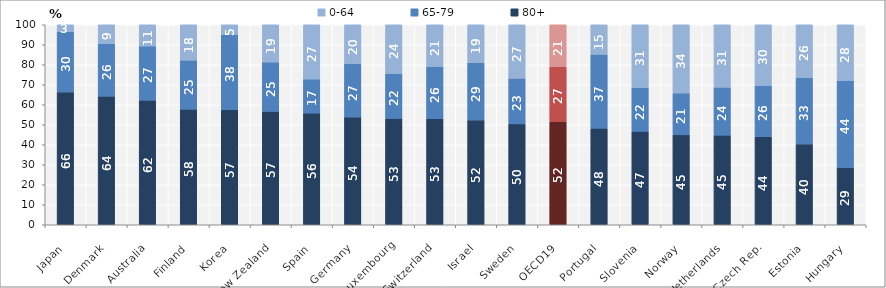
| Category | 80+ | 65-79 | 0-64 |
|---|---|---|---|
| Japan | 66.345 | 30.219 | 3.436 |
| Denmark | 64.263 | 26.3 | 9.436 |
| Australia | 62.239 | 27.13 | 10.632 |
| Finland | 57.755 | 24.544 | 17.701 |
| Korea | 57.478 | 37.637 | 4.885 |
| New Zealand | 56.681 | 24.674 | 18.645 |
| Spain | 55.833 | 17.016 | 27.151 |
| Germany | 53.925 | 26.562 | 19.514 |
| Luxembourg | 53.168 | 22.463 | 24.369 |
| Switzerland | 53.031 | 26.053 | 20.916 |
| Israel | 52.384 | 28.644 | 18.972 |
| Sweden | 50.44 | 22.765 | 26.795 |
| OECD19 | 51.647 | 27.374 | 20.978 |
| Portugal | 48.25 | 36.968 | 14.782 |
| Slovenia | 46.703 | 21.936 | 31.361 |
| Norway | 44.982 | 20.935 | 34.083 |
| Netherlands | 44.812 | 23.938 | 31.25 |
| Czech Rep. | 44.011 | 25.619 | 30.37 |
| Estonia | 40.386 | 33.183 | 26.43 |
| Hungary | 28.618 | 43.527 | 27.855 |